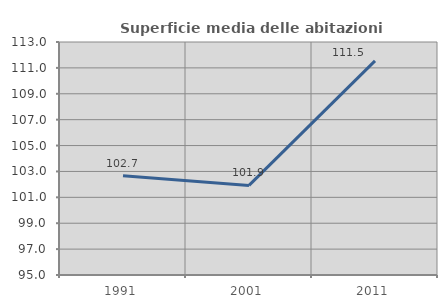
| Category | Superficie media delle abitazioni occupate |
|---|---|
| 1991.0 | 102.672 |
| 2001.0 | 101.921 |
| 2011.0 | 111.547 |